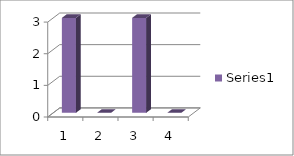
| Category | Series 0 |
|---|---|
| 0 | 3 |
| 1 | 0 |
| 2 | 3 |
| 3 | 0 |